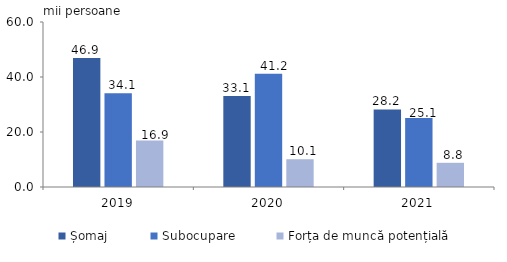
| Category | Șomaj | Subocupare | Forța de muncă potențială |
|---|---|---|---|
| 2019.0 | 46.9 | 34.1 | 16.9 |
| 2020.0 | 33.1 | 41.2 | 10.1 |
| 2021.0 | 28.2 | 25.1 | 8.8 |